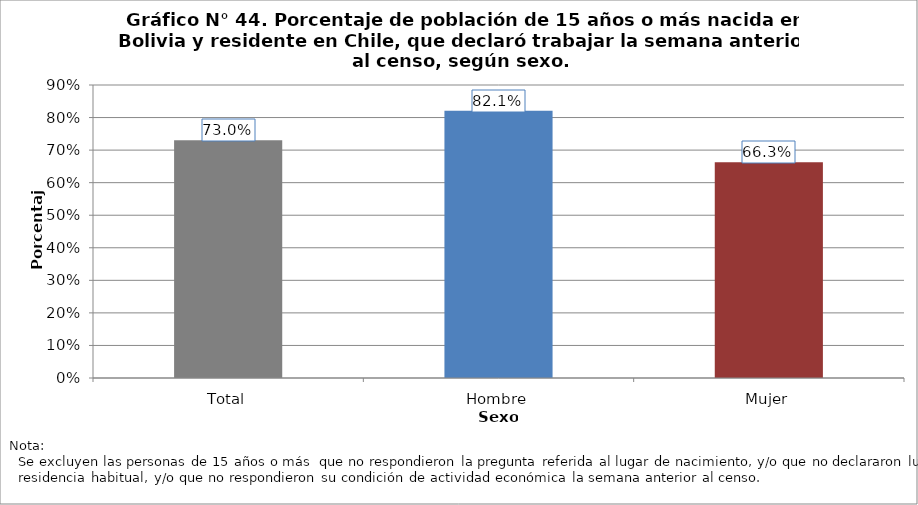
| Category | Población que declara trabajar |
|---|---|
| Total | 0.73 |
| Hombre | 0.821 |
| Mujer | 0.663 |